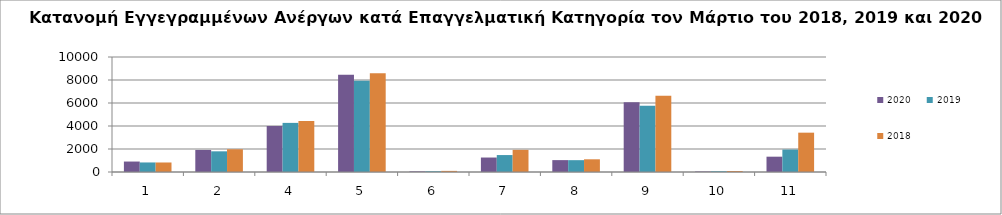
| Category | 2020 | 2019 | 2018 |
|---|---|---|---|
| 1.0 | 909 | 830 | 827 |
| 2.0 | 1918 | 1798 | 1978 |
| 4.0 | 4001 | 4271 | 4444 |
| 5.0 | 8454 | 7939 | 8595 |
| 6.0 | 54 | 65 | 97 |
| 7.0 | 1258 | 1473 | 1925 |
| 8.0 | 1033 | 1029 | 1104 |
| 9.0 | 6062 | 5771 | 6634 |
| 10.0 | 44 | 64 | 86 |
| 11.0 | 1332 | 1952 | 3420 |